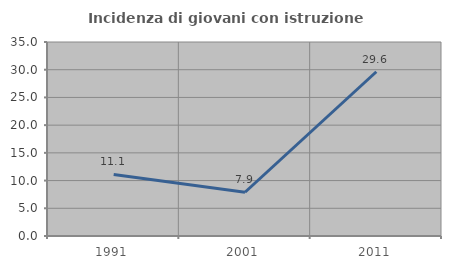
| Category | Incidenza di giovani con istruzione universitaria |
|---|---|
| 1991.0 | 11.111 |
| 2001.0 | 7.895 |
| 2011.0 | 29.63 |